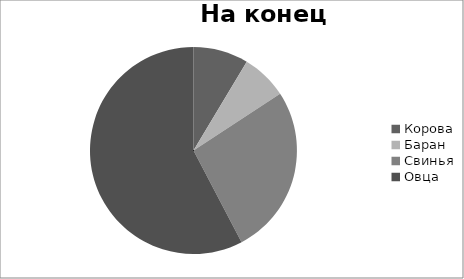
| Category | Series 0 |
|---|---|
| Корова | 600 |
| Баран | 500 |
| Свинья | 1850 |
| Овца | 4022 |